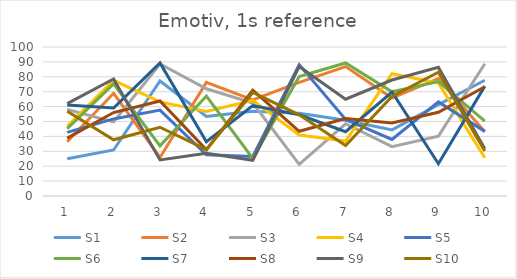
| Category | S1 | S2 | S3 | S4 | S5 | S6 | S7 | S8 | S9 | S10 |
|---|---|---|---|---|---|---|---|---|---|---|
| 1.0 | 25.02 | 36.35 | 58.02 | 46.82 | 42.67 | 45.24 | 61.02 | 38.83 | 61.98 | 56.87 |
| 2.0 | 30.88 | 68.94 | 49.78 | 77.67 | 51.73 | 75.27 | 59.08 | 56.01 | 78.55 | 37.71 |
| 3.0 | 77.22 | 25.89 | 88.61 | 63.17 | 57.67 | 33.66 | 89.35 | 63.78 | 24.23 | 46.15 |
| 4.0 | 53.39 | 76.26 | 71.95 | 56.73 | 27.64 | 67.07 | 36.39 | 31.03 | 28.6 | 31.14 |
| 5.0 | 56.85 | 64.48 | 62.32 | 64.25 | 26.48 | 25.17 | 60.69 | 71.08 | 23.97 | 69.49 |
| 6.0 | 55.48 | 76.28 | 21.24 | 40.97 | 88.2 | 80.12 | 54.54 | 43.41 | 86.9 | 54.46 |
| 7.0 | 50.86 | 86.87 | 48.48 | 36.86 | 51.41 | 89.3 | 43.15 | 52.04 | 64.96 | 33.92 |
| 8.0 | 44.36 | 65.71 | 33.13 | 82.04 | 37.93 | 69.91 | 69.77 | 49.05 | 77.83 | 66.87 |
| 9.0 | 61.33 | 78.9 | 40.19 | 75.82 | 63.18 | 76.78 | 21.65 | 56.21 | 86.44 | 83.03 |
| 10.0 | 77.7 | 43.09 | 88.73 | 25.72 | 43.37 | 50.18 | 73.74 | 73.33 | 31.7 | 30.25 |